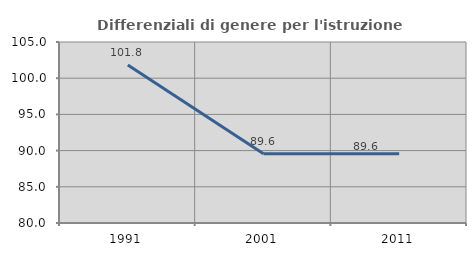
| Category | Differenziali di genere per l'istruzione superiore |
|---|---|
| 1991.0 | 101.826 |
| 2001.0 | 89.577 |
| 2011.0 | 89.556 |